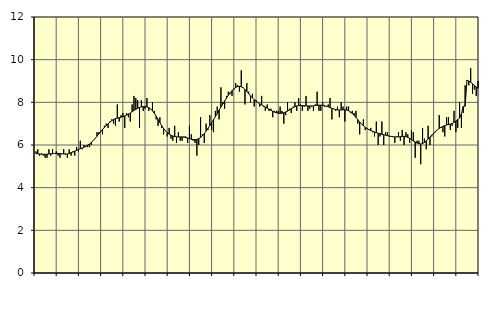
| Category | Piggar | Series 1 |
|---|---|---|
| nan | 5.7 | 5.6 |
| 1.0 | 5.8 | 5.59 |
| 1.0 | 5.5 | 5.58 |
| 1.0 | 5.6 | 5.57 |
| 1.0 | 5.5 | 5.57 |
| 1.0 | 5.4 | 5.56 |
| 1.0 | 5.4 | 5.57 |
| 1.0 | 5.8 | 5.58 |
| 1.0 | 5.5 | 5.59 |
| 1.0 | 5.8 | 5.59 |
| 1.0 | 5.6 | 5.6 |
| 1.0 | 5.7 | 5.61 |
| nan | 5.5 | 5.61 |
| 2.0 | 5.4 | 5.6 |
| 2.0 | 5.6 | 5.58 |
| 2.0 | 5.8 | 5.58 |
| 2.0 | 5.6 | 5.57 |
| 2.0 | 5.4 | 5.58 |
| 2.0 | 5.8 | 5.6 |
| 2.0 | 5.5 | 5.64 |
| 2.0 | 5.7 | 5.67 |
| 2.0 | 5.5 | 5.71 |
| 2.0 | 5.9 | 5.75 |
| 2.0 | 5.7 | 5.79 |
| nan | 6.2 | 5.83 |
| 3.0 | 5.8 | 5.86 |
| 3.0 | 6 | 5.9 |
| 3.0 | 5.9 | 5.95 |
| 3.0 | 5.9 | 5.99 |
| 3.0 | 5.9 | 6.05 |
| 3.0 | 6 | 6.13 |
| 3.0 | 6.2 | 6.21 |
| 3.0 | 6.3 | 6.31 |
| 3.0 | 6.6 | 6.41 |
| 3.0 | 6.6 | 6.52 |
| 3.0 | 6.6 | 6.63 |
| nan | 6.5 | 6.73 |
| 4.0 | 6.9 | 6.82 |
| 4.0 | 7 | 6.91 |
| 4.0 | 6.8 | 6.99 |
| 4.0 | 7.1 | 7.07 |
| 4.0 | 7.2 | 7.14 |
| 4.0 | 7 | 7.2 |
| 4.0 | 6.9 | 7.24 |
| 4.0 | 7.9 | 7.26 |
| 4.0 | 7.1 | 7.28 |
| 4.0 | 7.4 | 7.3 |
| 4.0 | 7.5 | 7.33 |
| nan | 6.8 | 7.36 |
| 5.0 | 7.5 | 7.4 |
| 5.0 | 7.3 | 7.45 |
| 5.0 | 7.1 | 7.5 |
| 5.0 | 7.9 | 7.56 |
| 5.0 | 8.3 | 7.62 |
| 5.0 | 8.2 | 7.67 |
| 5.0 | 8.1 | 7.72 |
| 5.0 | 6.8 | 7.76 |
| 5.0 | 8.1 | 7.79 |
| 5.0 | 7.6 | 7.8 |
| 5.0 | 7.7 | 7.8 |
| nan | 8.2 | 7.79 |
| 6.0 | 7.6 | 7.75 |
| 6.0 | 7.7 | 7.69 |
| 6.0 | 8 | 7.6 |
| 6.0 | 7.6 | 7.49 |
| 6.0 | 7.2 | 7.35 |
| 6.0 | 6.9 | 7.2 |
| 6.0 | 7.3 | 7.05 |
| 6.0 | 6.8 | 6.9 |
| 6.0 | 6.5 | 6.77 |
| 6.0 | 6.7 | 6.67 |
| 6.0 | 6.4 | 6.58 |
| nan | 6.8 | 6.51 |
| 7.0 | 6.3 | 6.46 |
| 7.0 | 6.2 | 6.42 |
| 7.0 | 6.9 | 6.4 |
| 7.0 | 6.1 | 6.38 |
| 7.0 | 6.6 | 6.38 |
| 7.0 | 6.2 | 6.38 |
| 7.0 | 6.2 | 6.38 |
| 7.0 | 6.4 | 6.37 |
| 7.0 | 6.4 | 6.35 |
| 7.0 | 6.1 | 6.33 |
| 7.0 | 6.9 | 6.3 |
| nan | 6.5 | 6.27 |
| 8.0 | 6.2 | 6.26 |
| 8.0 | 6.1 | 6.25 |
| 8.0 | 5.5 | 6.26 |
| 8.0 | 6 | 6.3 |
| 8.0 | 7.3 | 6.35 |
| 8.0 | 6.5 | 6.43 |
| 8.0 | 6.1 | 6.53 |
| 8.0 | 7 | 6.65 |
| 8.0 | 6.7 | 6.78 |
| 8.0 | 7.4 | 6.91 |
| 8.0 | 6.7 | 7.05 |
| nan | 6.6 | 7.19 |
| 9.0 | 7.6 | 7.33 |
| 9.0 | 7.8 | 7.47 |
| 9.0 | 7.2 | 7.63 |
| 9.0 | 8.7 | 7.78 |
| 9.0 | 8 | 7.92 |
| 9.0 | 7.7 | 8.07 |
| 9.0 | 8.3 | 8.2 |
| 9.0 | 8.5 | 8.33 |
| 9.0 | 8.4 | 8.45 |
| 9.0 | 8.3 | 8.55 |
| 9.0 | 8.6 | 8.63 |
| nan | 8.9 | 8.7 |
| 10.0 | 8.8 | 8.74 |
| 10.0 | 8.5 | 8.75 |
| 10.0 | 9.5 | 8.73 |
| 10.0 | 8.7 | 8.68 |
| 10.0 | 7.9 | 8.6 |
| 10.0 | 8.9 | 8.51 |
| 10.0 | 8.5 | 8.41 |
| 10.0 | 8 | 8.3 |
| 10.0 | 8.4 | 8.21 |
| 10.0 | 7.8 | 8.12 |
| 10.0 | 8.1 | 8.05 |
| nan | 8 | 7.99 |
| 11.0 | 7.8 | 7.93 |
| 11.0 | 8.3 | 7.88 |
| 11.0 | 7.8 | 7.83 |
| 11.0 | 7.6 | 7.78 |
| 11.0 | 7.9 | 7.73 |
| 11.0 | 7.6 | 7.68 |
| 11.0 | 7.7 | 7.63 |
| 11.0 | 7.3 | 7.58 |
| 11.0 | 7.6 | 7.54 |
| 11.0 | 7.6 | 7.51 |
| 11.0 | 7.6 | 7.49 |
| nan | 7.8 | 7.48 |
| 12.0 | 7.6 | 7.49 |
| 12.0 | 7 | 7.51 |
| 12.0 | 7.4 | 7.55 |
| 12.0 | 8 | 7.59 |
| 12.0 | 7.7 | 7.64 |
| 12.0 | 7.5 | 7.7 |
| 12.0 | 7.8 | 7.75 |
| 12.0 | 8 | 7.8 |
| 12.0 | 7.6 | 7.83 |
| 12.0 | 8.2 | 7.85 |
| 12.0 | 7.9 | 7.86 |
| nan | 7.6 | 7.85 |
| 13.0 | 7.8 | 7.84 |
| 13.0 | 8.3 | 7.84 |
| 13.0 | 7.6 | 7.83 |
| 13.0 | 7.7 | 7.83 |
| 13.0 | 7.8 | 7.83 |
| 13.0 | 7.6 | 7.83 |
| 13.0 | 7.9 | 7.85 |
| 13.0 | 8.5 | 7.86 |
| 13.0 | 7.6 | 7.87 |
| 13.0 | 7.6 | 7.87 |
| 13.0 | 8 | 7.86 |
| nan | 7.8 | 7.84 |
| 14.0 | 7.8 | 7.82 |
| 14.0 | 7.9 | 7.79 |
| 14.0 | 8.2 | 7.75 |
| 14.0 | 7.2 | 7.72 |
| 14.0 | 7.7 | 7.69 |
| 14.0 | 7.6 | 7.66 |
| 14.0 | 7.8 | 7.65 |
| 14.0 | 7.3 | 7.64 |
| 14.0 | 8 | 7.64 |
| 14.0 | 7.8 | 7.65 |
| 14.0 | 7.1 | 7.65 |
| nan | 7.8 | 7.64 |
| 15.0 | 7.8 | 7.61 |
| 15.0 | 7.5 | 7.55 |
| 15.0 | 7.6 | 7.48 |
| 15.0 | 7.5 | 7.39 |
| 15.0 | 7.6 | 7.29 |
| 15.0 | 7 | 7.19 |
| 15.0 | 6.5 | 7.08 |
| 15.0 | 7 | 6.99 |
| 15.0 | 7.2 | 6.9 |
| 15.0 | 6.7 | 6.83 |
| 15.0 | 6.8 | 6.77 |
| nan | 6.7 | 6.72 |
| 16.0 | 6.8 | 6.68 |
| 16.0 | 6.6 | 6.64 |
| 16.0 | 6.4 | 6.61 |
| 16.0 | 7.1 | 6.58 |
| 16.0 | 6 | 6.55 |
| 16.0 | 6.4 | 6.53 |
| 16.0 | 7.1 | 6.5 |
| 16.0 | 6 | 6.48 |
| 16.0 | 6.6 | 6.46 |
| 16.0 | 6.6 | 6.44 |
| 16.0 | 6.4 | 6.42 |
| nan | 6.4 | 6.4 |
| 17.0 | 6.4 | 6.39 |
| 17.0 | 6.1 | 6.38 |
| 17.0 | 6.4 | 6.38 |
| 17.0 | 6.6 | 6.38 |
| 17.0 | 6.2 | 6.39 |
| 17.0 | 6.7 | 6.4 |
| 17.0 | 6 | 6.41 |
| 17.0 | 6.6 | 6.39 |
| 17.0 | 6.5 | 6.36 |
| 17.0 | 6.1 | 6.31 |
| 17.0 | 6.7 | 6.26 |
| nan | 6.6 | 6.19 |
| 18.0 | 5.4 | 6.14 |
| 18.0 | 6.2 | 6.09 |
| 18.0 | 6.2 | 6.06 |
| 18.0 | 5.1 | 6.05 |
| 18.0 | 6.8 | 6.07 |
| 18.0 | 6.3 | 6.12 |
| 18.0 | 5.8 | 6.19 |
| 18.0 | 6.9 | 6.28 |
| 18.0 | 6 | 6.37 |
| 18.0 | 6.4 | 6.47 |
| 18.0 | 6.5 | 6.56 |
| nan | 6.6 | 6.64 |
| 19.0 | 6.7 | 6.71 |
| 19.0 | 7.4 | 6.78 |
| 19.0 | 6.8 | 6.83 |
| 19.0 | 6.6 | 6.88 |
| 19.0 | 6.4 | 6.91 |
| 19.0 | 7.3 | 6.94 |
| 19.0 | 7.3 | 6.96 |
| 19.0 | 6.7 | 6.98 |
| 19.0 | 6.9 | 7.01 |
| 19.0 | 7.6 | 7.06 |
| 19.0 | 6.6 | 7.12 |
| nan | 6.8 | 7.19 |
| 20.0 | 8 | 7.26 |
| 20.0 | 6.8 | 7.47 |
| 20.0 | 7.5 | 7.81 |
| 20.0 | 8.8 | 7.82 |
| 20.0 | 9 | 9.04 |
| 20.0 | 8.8 | 9 |
| 20.0 | 9.6 | 8.94 |
| 20.0 | 8.4 | 8.87 |
| 20.0 | 8.6 | 8.79 |
| 20.0 | 8.3 | 8.72 |
| 20.0 | 9 | 8.66 |